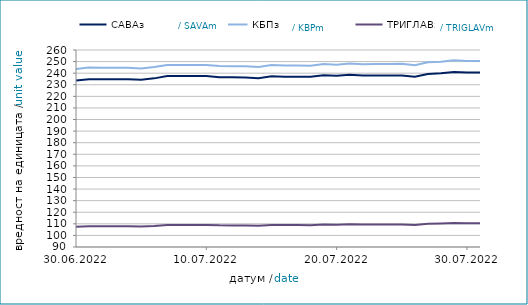
| Category | САВАз | КБПз | ТРИГЛАВз |
|---|---|---|---|
| 2022-06-30 | 233.589 | 243.617 | 107.431 |
| 2022-07-01 | 234.845 | 244.811 | 107.998 |
| 2022-07-02 | 234.669 | 244.617 | 107.909 |
| 2022-07-03 | 234.681 | 244.63 | 107.913 |
| 2022-07-04 | 234.748 | 244.645 | 107.932 |
| 2022-07-05 | 234.425 | 244.105 | 107.694 |
| 2022-07-06 | 235.522 | 245.238 | 108.195 |
| 2022-07-07 | 237.478 | 247.105 | 108.974 |
| 2022-07-08 | 237.468 | 247.037 | 108.969 |
| 2022-07-09 | 237.548 | 247.134 | 109.015 |
| 2022-07-10 | 237.56 | 247.147 | 109.019 |
| 2022-07-11 | 236.572 | 246.222 | 108.678 |
| 2022-07-12 | 236.449 | 246.036 | 108.652 |
| 2022-07-13 | 236.329 | 246.005 | 108.642 |
| 2022-07-14 | 235.658 | 245.365 | 108.349 |
| 2022-07-15 | 237.255 | 246.96 | 109.063 |
| 2022-07-16 | 236.964 | 246.623 | 108.922 |
| 2022-07-17 | 236.976 | 246.636 | 108.926 |
| 2022-07-18 | 236.82 | 246.469 | 108.836 |
| 2022-07-19 | 238.126 | 247.821 | 109.374 |
| 2022-07-20 | 237.738 | 247.215 | 109.157 |
| 2022-07-21 | 238.654 | 248.292 | 109.539 |
| 2022-07-22 | 238.007 | 247.783 | 109.364 |
| 2022-07-23 | 238.09 | 247.854 | 109.392 |
| 2022-07-24 | 238.101 | 247.868 | 109.396 |
| 2022-07-25 | 238.064 | 248.06 | 109.504 |
| 2022-07-26 | 237.001 | 246.941 | 109.087 |
| 2022-07-27 | 239.267 | 249.346 | 110.02 |
| 2022-07-28 | 239.922 | 249.962 | 110.285 |
| 2022-07-29 | 240.931 | 251.099 | 110.767 |
| 2022-07-30 | 240.493 | 250.588 | 110.555 |
| 2022-07-31 | 240.505 | 250.601 | 110.559 |